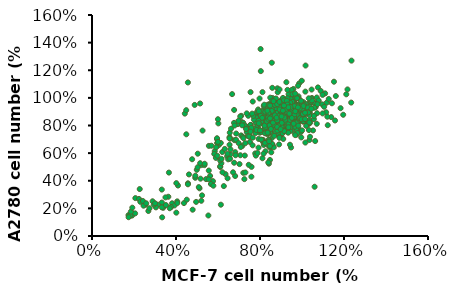
| Category | A2780 |
|---|---|
| 0.9499618999237999 | 0.926 |
| 0.8483616967233935 | 0.641 |
| 0.9154178308356616 | 0.842 |
| 0.9621539243078486 | 0.882 |
| 0.6817373634747269 | 0.434 |
| 1.0261620523241046 | 0.816 |
| 0.9885699771399543 | 0.89 |
| 0.9560579121158242 | 0.91 |
| 0.5120650241300483 | 0.345 |
| 0.8483616967233935 | 0.92 |
| 0.9306578613157226 | 0.902 |
| 0.8859537719075438 | 0.91 |
| 0.8768097536195072 | 0.878 |
| 1.0353060706121413 | 0.838 |
| 1.0170180340360682 | 0.904 |
| 1.034290068580137 | 0.963 |
| 0.9824739649479299 | 0.783 |
| 0.969265938531877 | 0.833 |
| 0.9001778003556007 | 0.89 |
| 0.905257810515621 | 0.914 |
| 0.8757937515875032 | 0.859 |
| 0.8879857759715519 | 0.933 |
| 0.936753873507747 | 0.911 |
| 0.9865379730759462 | 1.105 |
| 1.0525781051562104 | 0.765 |
| 1.0373380746761494 | 0.891 |
| 0.9540259080518161 | 0.89 |
| 0.9611379222758446 | 0.976 |
| 0.9357378714757429 | 0.853 |
| 0.9499618999237999 | 0.89 |
| 1.0363220726441453 | 0.936 |
| 1.0759461518923037 | 1.076 |
| 1.0353060706121413 | 0.695 |
| 0.9824739649479299 | 0.823 |
| 0.936753873507747 | 0.873 |
| 0.9144018288036576 | 0.806 |
| 0.4490728981457963 | 0.736 |
| 1.0078740157480315 | 0.968 |
| 1.1389382778765558 | 0.861 |
| 0.9255778511557023 | 1.113 |
| 1.062738125476251 | 0.687 |
| 0.9743459486918974 | 0.734 |
| 1.032258064516129 | 0.811 |
| 0.5760731521463043 | 0.397 |
| 0.904241808483617 | 0.843 |
| 0.9357378714757429 | 0.973 |
| 0.9702819405638812 | 0.862 |
| 0.9804419608839218 | 0.943 |
| 0.9286258572517145 | 0.798 |
| 1.016002032004064 | 0.676 |
| 0.9946659893319787 | 0.753 |
| 1.0048260096520194 | 0.827 |
| 0.9306578613157226 | 0.821 |
| 1.0200660401320802 | 0.797 |
| 1.1206502413004826 | 0.864 |
| 1.0891541783083567 | 1.05 |
| 0.9479298958597917 | 0.641 |
| 0.7772415544831089 | 0.598 |
| 0.8910337820675641 | 0.74 |
| 0.9662179324358648 | 0.743 |
| 0.8625857251714504 | 0.825 |
| 0.9733299466598934 | 0.774 |
| 1.157226314452629 | 0.836 |
| 1.1836423672847345 | 0.925 |
| 0.858521717043434 | 1.073 |
| 0.9641859283718568 | 0.79 |
| 0.9133858267716536 | 0.759 |
| 0.8839217678435357 | 0.863 |
| 0.8859537719075438 | 0.848 |
| 1.030226060452121 | 0.888 |
| 0.983489966979934 | 0.93 |
| 1.016002032004064 | 1.045 |
| 0.9286258572517145 | 0.853 |
| 0.9113538227076454 | 0.802 |
| 0.8473456946913894 | 0.55 |
| 0.6136652273304547 | 0.227 |
| 0.9499618999237999 | 0.771 |
| 1.0058420116840234 | 0.832 |
| 1.1226822453644907 | 0.802 |
| 1.1176022352044703 | 0.965 |
| 0.8775356874530428 | 0.821 |
| 0.8474830954169797 | 0.874 |
| 0.9821187077385425 | 0.882 |
| 1.0001502629601804 | 0.921 |
| 0.9304282494365139 | 0.927 |
| 0.983320811419985 | 1.011 |
| 0.8883546205860255 | 0.96 |
| 0.9448534936138242 | 0.76 |
| 0.8847483095416979 | 0.969 |
| 0.909992486851991 | 0.792 |
| 0.6034560480841472 | 0.657 |
| 0.9172051089406461 | 0.93 |
| 0.9111945905334335 | 0.976 |
| 0.9051840721262209 | 0.968 |
| 0.9003756574004508 | 0.948 |
| 0.9039819684447784 | 0.94 |
| 0.9051840721262209 | 0.909 |
| 0.9460555972952667 | 0.84 |
| 0.958076634109692 | 0.816 |
| 0.5265214124718257 | 0.763 |
| 0.9208114199849737 | 0.821 |
| 0.7801652892561983 | 0.582 |
| 0.9460555972952667 | 0.844 |
| 0.983320811419985 | 0.909 |
| 1.0049586776859505 | 0.934 |
| 0.9953418482344102 | 0.878 |
| 0.988129226145755 | 0.867 |
| 0.8739293764087153 | 0.905 |
| 0.9003756574004508 | 0.983 |
| 0.9448534936138242 | 1.007 |
| 0.9484598046581517 | 0.944 |
| 1.0169797145003756 | 1.234 |
| 0.9688955672426747 | 0.831 |
| 0.7981968444778362 | 0.862 |
| 0.9184072126220887 | 0.969 |
| 0.9460555972952667 | 0.819 |
| 0.8823441021788129 | 0.812 |
| 0.8943651389932382 | 0.829 |
| 0.9051840721262209 | 0.829 |
| 0.9111945905334335 | 0.829 |
| 0.8246431254695717 | 0.911 |
| 0.9592787377911345 | 0.968 |
| 0.8883546205860255 | 0.933 |
| 0.8679188580015026 | 0.87 |
| 0.8967693463561233 | 0.927 |
| 0.783771600300526 | 0.889 |
| 0.8474830954169797 | 0.858 |
| 0.8895567242674681 | 0.882 |
| 0.667167543200601 | 1.027 |
| 0.8210368144252442 | 0.924 |
| 0.9688955672426747 | 0.848 |
| 0.520510894064613 | 0.255 |
| 0.8751314800901577 | 0.883 |
| 0.9712997746055597 | 0.948 |
| 0.9208114199849737 | 0.886 |
| 0.98572501878287 | 0.94 |
| 0.7441021788129226 | 0.87 |
| 0.6912096168294516 | 0.81 |
| 0.9592787377911345 | 0.913 |
| 0.8186326070623591 | 0.913 |
| 0.8246431254695717 | 0.863 |
| 0.8667167543200601 | 0.934 |
| 0.9556724267468069 | 0.923 |
| 0.4916604057099925 | 0.422 |
| 0.7597295266716755 | 0.501 |
| 0.9869271224643126 | 0.835 |
| 0.887152516904583 | 0.795 |
| 0.909992486851991 | 0.896 |
| 0.6106686701728024 | 0.5 |
| 0.9364387678437265 | 0.87 |
| 1.0446280991735537 | 0.969 |
| 0.9508640120210368 | 1.019 |
| 1.033809166040571 | 0.911 |
| 0.9340345604808414 | 0.94 |
| 0.7873779113448535 | 0.902 |
| 0.9676934635612322 | 0.89 |
| 0.8847483095416979 | 0.928 |
| 0.9496619083395943 | 0.944 |
| 1.063861758076634 | 0.96 |
| 0.9773102930127724 | 0.896 |
| 0.9427189012018106 | 0.661 |
| 0.9152489464648041 | 0.799 |
| 0.8415795223973779 | 0.828 |
| 0.9302325581395349 | 0.792 |
| 0.8503199625409709 | 0.863 |
| 0.961448415795224 | 0.875 |
| 0.9264866552208522 | 0.881 |
| 0.678008428281567 | 0.694 |
| 0.9352270953644451 | 0.81 |
| 0.9477134384267207 | 0.932 |
| 0.8827844545028875 | 0.932 |
| 0.8415795223973779 | 0.905 |
| 0.9077571406274387 | 0.968 |
| 0.8128609333541439 | 0.816 |
| 0.8365849851724676 | 0.87 |
| 0.941470266895583 | 0.852 |
| 0.9140003121585766 | 0.825 |
| 0.4570001560792883 | 0.381 |
| 0.83533635086624 | 0.948 |
| 0.9189948493834869 | 0.917 |
| 0.884033088809115 | 0.877 |
| 0.8802871858904323 | 0.937 |
| 0.8478226939285157 | 0.891 |
| 0.9826751990010926 | 0.889 |
| 0.9452161698142656 | 0.866 |
| 0.872795380053067 | 0.819 |
| 0.9589511471827689 | 0.866 |
| 0.4420165444045575 | 0.886 |
| 0.9976588106758233 | 0.923 |
| 0.9189948493834869 | 0.898 |
| 0.9252380209146246 | 0.841 |
| 0.904011237708756 | 0.834 |
| 0.9976588106758233 | 0.944 |
| 0.9277352895270797 | 0.782 |
| 0.9364757296706727 | 0.926 |
| 0.9227407523021695 | 0.923 |
| 0.855314499765881 | 0.707 |
| 0.9102544092398939 | 0.946 |
| 0.9876697362260028 | 0.845 |
| 0.9339784610582176 | 0.912 |
| 0.9027626034025285 | 0.829 |
| 0.9102544092398939 | 0.96 |
| 1.038863742781333 | 0.82 |
| 0.8403308880911503 | 0.937 |
| 0.83533635086624 | 0.937 |
| 0.9189948493834869 | 0.962 |
| 0.9227407523021695 | 0.919 |
| 0.9577025128765413 | 0.868 |
| 0.9364757296706727 | 0.783 |
| 0.9002653347900733 | 0.947 |
| 0.8877789917277977 | 0.947 |
| 0.8678008428281567 | 0.92 |
| 0.8653035742157016 | 0.907 |
| 0.9626970501014516 | 0.94 |
| 1.0476041829249259 | 0.999 |
| 1.0076478851256438 | 0.95 |
| 0.9152489464648041 | 0.801 |
| 0.8915248946464804 | 0.861 |
| 0.9676915873263618 | 0.866 |
| 0.9764320274699547 | 0.949 |
| 0.9214921179959419 | 0.9 |
| 1.0963009208678007 | 0.953 |
| 1.1150304354612144 | 0.896 |
| 1.1425003901982207 | 0.961 |
| 1.0563446230685187 | 0.846 |
| 0.9252380209146246 | 0.851 |
| 0.9589511471827689 | 1.064 |
| 0.7978773216794132 | 0.995 |
| 0.9851724676135477 | 0.994 |
| 1.0538473544560636 | 0.966 |
| 1.0650850632121118 | 0.933 |
| 0.9664429530201343 | 0.933 |
| 0.9577025128765413 | 0.935 |
| 0.9514593413454034 | 0.891 |
| 1.0438582800062433 | 0.973 |
| 0.904011237708756 | 0.903 |
| 0.6105821757452786 | 0.505 |
| 1.0176369595754644 | 0.93 |
| 1.0451069143124707 | 0.995 |
| 1.110035898236304 | 1.032 |
| 1.0180699730872742 | 0.927 |
| 0.9862873253876714 | 0.925 |
| 0.9463027040881712 | 0.925 |
| 0.878636421889017 | 0.81 |
| 0.9698833781878765 | 0.864 |
| 0.9196462898885044 | 0.958 |
| 0.9257977700884276 | 0.925 |
| 0.8929898756888376 | 0.922 |
| 1.0354991669870564 | 0.874 |
| 0.9965397923875432 | 0.714 |
| 0.9134948096885813 | 0.866 |
| 0.9268230167884147 | 0.892 |
| 0.9104190695886197 | 0.903 |
| 0.8745354350890683 | 0.954 |
| 0.8581314878892734 | 0.963 |
| 1.0180699730872742 | 0.954 |
| 1.0703575547866204 | 0.812 |
| 0.9780853517877739 | 0.745 |
| 0.8499295142893759 | 0.831 |
| 0.9698833781878765 | 0.87 |
| 0.9309240035883635 | 0.931 |
| 0.9534794309880815 | 0.858 |
| 0.9709086248878637 | 0.865 |
| 0.9422017172882224 | 0.856 |
| 1.0129437395873382 | 0.879 |
| 0.8940151223888249 | 0.866 |
| 0.9339997436883251 | 0.942 |
| 0.8806869152889915 | 0.833 |
| 0.9852620786876842 | 0.952 |
| 0.939125977188261 | 0.885 |
| 0.9575804177880303 | 0.912 |
| 0.9545046776880687 | 0.897 |
| 1.0262719466871717 | 0.904 |
| 0.9381007304882737 | 0.909 |
| 0.9504036908881199 | 0.936 |
| 0.9360502370882994 | 0.802 |
| 0.9022170959887222 | 0.889 |
| 0.9339997436883251 | 0.781 |
| 0.9257977700884276 | 0.919 |
| 0.972959118287838 | 0.904 |
| 0.8468537741894143 | 0.673 |
| 0.9914135588876073 | 0.941 |
| 0.9534794309880815 | 0.916 |
| 0.9001666025887479 | 0.733 |
| 0.8970908624887863 | 0.858 |
| 0.9442522106881969 | 0.787 |
| 0.8673587081891581 | 0.881 |
| 0.9627066512879662 | 0.97 |
| 1.000640779187492 | 0.764 |
| 0.9350249903883122 | 0.897 |
| 0.9073433294886583 | 0.913 |
| 0.995514545687556 | 0.921 |
| 0.9145200563885685 | 0.897 |
| 0.9134948096885813 | 0.981 |
| 0.9093938228886326 | 1 |
| 0.9339997436883251 | 0.973 |
| 0.9216967832884788 | 0.91 |
| 0.9780853517877739 | 0.825 |
| 0.9268230167884147 | 0.932 |
| 0.9791105984877612 | 0.918 |
| 0.9032423426887095 | 0.749 |
| 0.9483531974881456 | 0.955 |
| 0.9401512238882481 | 0.982 |
| 0.8601819812892477 | 0.66 |
| 0.9206715365884917 | 0.933 |
| 0.9442522106881969 | 0.94 |
| 0.9637318979879533 | 0.94 |
| 1.0108932461873639 | 0.883 |
| 0.9339997436883251 | 0.748 |
| 0.9514289375881071 | 0.881 |
| 0.9319492502883506 | 0.956 |
| 0.8960656157887992 | 0.962 |
| 0.9001666025887479 | 0.92 |
| 0.939125977188261 | 0.895 |
| 0.9862873253876714 | 0.911 |
| 1.0037165192874535 | 0.945 |
| 1.000640779187492 | 0.925 |
| 1.0016660258874792 | 0.96 |
| 1.0098679994873767 | 0.948 |
| 0.9657823913879278 | 0.989 |
| 0.8424450272342142 | 0.954 |
| 0.9618721000605205 | 0.946 |
| 0.9166834779100262 | 0.98 |
| 0.7843453701835787 | 0.76 |
| 0.7746620940084729 | 0.764 |
| 0.936050030260238 | 1.027 |
| 0.9812386524107323 | 0.904 |
| 0.9876941698608029 | 0.842 |
| 0.9860802904982853 | 0.851 |
| 0.9505749445228969 | 0.856 |
| 0.8117813193463789 | 1.042 |
| 0.45672785959249546 | 1.112 |
| 0.9070002017349204 | 0.872 |
| 0.8827920112971556 | 0.854 |
| 0.3340730280411539 | 0.135 |
| 1.0038329634859795 | 0.883 |
| 0.9634859794230382 | 0.949 |
| 0.4486584627799072 | 0.911 |
| 0.9344361508977204 | 0.925 |
| 0.8456727859592496 | 0.88 |
| 0.802098043171273 | 0.894 |
| 0.8182368367964494 | 0.659 |
| 1.0215856364736735 | 0.898 |
| 1.032882792011297 | 0.899 |
| 0.8827920112971556 | 1.069 |
| 0.4793221706677426 | 0.19 |
| 0.9473471857978616 | 0.932 |
| 0.9215251159975791 | 0.893 |
| 0.8827920112971556 | 0.933 |
| 0.9118418398224732 | 0.96 |
| 0.8682670970344967 | 0.862 |
| 1.005446842848497 | 0.917 |
| 0.5955214847690136 | 0.701 |
| 0.9231389953600968 | 0.908 |
| 0.9505749445228969 | 0.957 |
| 0.9473471857978616 | 0.897 |
| 0.9538027032479323 | 0.924 |
| 0.9005446842848497 | 0.912 |
| 0.4890054468428485 | 0.949 |
| 0.9893080492233206 | 0.915 |
| 0.7520677829332257 | 0.681 |
| 0.7891870082711318 | 0.839 |
| 0.9747831349606617 | 0.879 |
| 0.9344361508977204 | 0.816 |
| 0.9134557191849909 | 0.972 |
| 0.9909219285858382 | 0.938 |
| 0.6277990720193666 | 0.361 |
| 1.047407706273956 | 0.981 |
| 0.9005446842848497 | 0.859 |
| 0.940891668347791 | 0.904 |
| 0.9521888238854146 | 0.993 |
| 0.9150695985475086 | 0.856 |
| 0.9989913253984265 | 1.124 |
| 0.936050030260238 | 0.989 |
| 0.9021585636473674 | 0.927 |
| 0.514827516643131 | 0.959 |
| 0.8440589065967319 | 0.699 |
| 0.8537421827718378 | 0.746 |
| 0.898930804922332 | 0.762 |
| 0.8263062336090378 | 0.614 |
| 0.8747226144845672 | 0.799 |
| 0.8698809763970143 | 0.85 |
| 0.8601977002219084 | 0.999 |
| 0.9602582206980028 | 0.813 |
| 0.6939681258825903 | 0.811 |
| 0.9005446842848497 | 0.857 |
| 0.9279806334476498 | 0.877 |
| 0.9215251159975791 | 0.87 |
| 0.9618721000605205 | 0.936 |
| 0.978010893685697 | 0.998 |
| 1.0457938269114384 | 1.06 |
| 1.032882792011297 | 0.767 |
| 0.9425055477103087 | 0.841 |
| 0.8133951987088965 | 0.851 |
| 0.8279201129715553 | 0.792 |
| 0.9021585636473674 | 0.822 |
| 0.9909219285858382 | 0.853 |
| 0.9554165826104498 | 0.971 |
| 0.9812386524107323 | 1.088 |
| 1.0780714141617913 | 0.979 |
| 0.5663830470380479 | 0.377 |
| 0.3390592390431851 | 0.204 |
| 0.2684218975758549 | 0.181 |
| 0.8604912506020228 | 0.84 |
| 0.7500401348531064 | 0.737 |
| 0.8437951517097447 | 0.859 |
| 0.7371969818590464 | 0.752 |
| 0.9580992133568791 | 0.979 |
| 0.5085888585647776 | 0.354 |
| 0.33263766254615507 | 0.242 |
| 0.5625301011398298 | 0.435 |
| 0.6819714239845882 | 0.607 |
| 0.8759030341948948 | 0.888 |
| 0.8592069353026168 | 0.894 |
| 0.946540375662225 | 0.991 |
| 0.8476480976079628 | 0.776 |
| 0.33263766254615507 | 0.207 |
| 0.5779418847327019 | 0.364 |
| 0.8142558998234066 | 0.696 |
| 0.8476480976079628 | 0.752 |
| 0.8990207095842029 | 0.789 |
| 0.7795793867394445 | 0.782 |
| 0.8283833681168727 | 0.747 |
| 0.7988441162305346 | 0.748 |
| 0.911863862578263 | 0.822 |
| 0.7102263605715203 | 0.728 |
| 0.5561085246427998 | 0.474 |
| 0.31337293305506503 | 0.227 |
| 0.6858243698828063 | 0.696 |
| 0.7063734146733023 | 0.585 |
| 0.304382725959223 | 0.207 |
| 0.8656285117996468 | 0.642 |
| 0.7423342430566704 | 0.724 |
| 0.7654519184459785 | 0.974 |
| 0.3634612297318992 | 0.284 |
| 0.7988441162305346 | 0.835 |
| 0.7590303419489485 | 0.429 |
| 0.8848932412907369 | 0.845 |
| 0.6434419650024081 | 0.577 |
| 0.7205008829667684 | 0.457 |
| 0.5240006421576497 | 0.294 |
| 0.7333440359608284 | 0.792 |
| 0.7564617113501365 | 0.804 |
| 0.648579226200032 | 0.555 |
| 0.8759030341948948 | 0.922 |
| 0.906726601380639 | 0.793 |
| 0.8861775565901429 | 0.802 |
| 0.8373735752127147 | 0.946 |
| 0.8116872692245947 | 0.563 |
| 0.8168245304222187 | 0.852 |
| 0.8412265211109328 | 0.696 |
| 0.4957457055707176 | 0.247 |
| 0.6768341627869642 | 0.53 |
| 0.8348049446139028 | 0.736 |
| 0.8913148177877669 | 0.727 |
| 0.8142558998234066 | 0.871 |
| 0.8913148177877669 | 0.881 |
| 0.8656285117996468 | 0.887 |
| 0.8296676834162787 | 0.76 |
| 0.8694814576978648 | 0.889 |
| 0.38144164392358326 | 0.237 |
| 0.40584363461229733 | 0.251 |
| 0.4379515170974474 | 0.238 |
| 0.8232461069192487 | 0.796 |
| 0.8348049446139028 | 0.943 |
| 0.8001284315299406 | 0.878 |
| 0.8489324129073688 | 1.002 |
| 0.8104029539251887 | 0.902 |
| 0.8592069353026168 | 0.786 |
| 0.6716969015893401 | 0.461 |
| 0.8861775565901429 | 0.738 |
| 0.9503933215604431 | 1.057 |
| 0.39300048161823725 | 0.221 |
| 0.635736073205972 | 0.448 |
| 0.7937068550329106 | 0.703 |
| 0.7487558195537004 | 0.72 |
| 0.8155402151228126 | 0.679 |
| 0.8399422058115267 | 0.655 |
| 0.8925991330871729 | 0.717 |
| 0.8759030341948948 | 0.995 |
| 0.7657393850658858 | 0.712 |
| 0.9985358711566618 | 0.844 |
| 1.0717423133235724 | 0.889 |
| 0.3762811127379209 | 0.21 |
| 1.0702781844802343 | 1.003 |
| 1.0571010248901904 | 0.869 |
| 1.0351390922401171 | 0.822 |
| 1.2108345534407028 | 1.026 |
| 0.9019033674963397 | 0.792 |
| 0.49194729136163984 | 0.436 |
| 0.7920937042459737 | 0.861 |
| 0.8843338213762811 | 1.041 |
| 0.821376281112738 | 0.778 |
| 0.8345534407027818 | 0.891 |
| 0.4568081991215227 | 0.374 |
| 0.9692532942898975 | 1.001 |
| 0.6764275256222547 | 0.819 |
| 0.5036603221083455 | 0.596 |
| 0.8784773060029283 | 0.89 |
| 0.8330893118594437 | 0.89 |
| 0.7276720351390923 | 0.583 |
| 0.34992679355783307 | 0.28 |
| 1.0790629575402635 | 0.981 |
| 1.1522693997071742 | 1.117 |
| 0.9106881405563689 | 0.703 |
| 0.9150805270863837 | 0.885 |
| 0.8843338213762811 | 0.852 |
| 0.8872620790629575 | 0.799 |
| 1.0732064421669107 | 0.954 |
| 1.2342606149341142 | 0.966 |
| 1.1961932650073206 | 0.878 |
| 1.0600292825768667 | 0.357 |
| 0.8740849194729137 | 0.756 |
| 0.8916544655929722 | 0.847 |
| 0.9150805270863837 | 0.943 |
| 0.91800878477306 | 0.829 |
| 0.9765739385065886 | 0.998 |
| 1.026354319180088 | 0.93 |
| 1.0014641288433381 | 0.922 |
| 1.0585651537335286 | 0.929 |
| 1.0380673499267936 | 0.718 |
| 0.8667642752562226 | 0.804 |
| 0.83601756954612 | 0.787 |
| 0.9575402635431918 | 0.853 |
| 1.1054172767203514 | 0.936 |
| 1.1273792093704247 | 0.992 |
| 1.1610541727672035 | 1.013 |
| 0.9516837481698389 | 0.966 |
| 0.6588579795021962 | 0.59 |
| 0.2547584187408492 | 0.227 |
| 0.9150805270863837 | 0.847 |
| 0.2884333821376281 | 0.251 |
| 0.8374816983894583 | 0.745 |
| 1.0980966325036603 | 1.022 |
| 0.9956076134699854 | 0.979 |
| 1.2357247437774523 | 1.27 |
| 0.9619326500732065 | 0.86 |
| 0.7159590043923866 | 0.652 |
| 0.9077598828696926 | 0.744 |
| 0.8169838945827232 | 0.596 |
| 0.9502196193265008 | 0.909 |
| 0.8535871156661786 | 0.606 |
| 1.0980966325036603 | 0.888 |
| 1.2166910688140555 | 1.061 |
| 0.9677891654465594 | 0.73 |
| 0.5212298682284041 | 0.513 |
| 0.29428989751098095 | 0.227 |
| 0.9707174231332357 | 0.905 |
| 0.3323572474377745 | 0.336 |
| 0.3001464128843338 | 0.237 |
| 0.6456808199121523 | 0.418 |
| 0.9399707174231332 | 0.881 |
| 0.8828696925329429 | 0.764 |
| 0.9341142020497804 | 0.943 |
| 0.8448023426061494 | 0.801 |
| 0.849194729136164 | 0.894 |
| 0.8535871156661786 | 0.862 |
| 0.7759882869692533 | 0.841 |
| 0.8814055636896047 | 0.789 |
| 0.7935578330893118 | 0.774 |
| 0.6203150461705594 | 0.608 |
| 0.8843020097772949 | 0.963 |
| 0.6865833785985878 | 0.742 |
| 0.7332971211298207 | 0.791 |
| 0.8908202064095601 | 0.663 |
| 0.8245518739815317 | 0.787 |
| 0.8669201520912547 | 0.873 |
| 0.8614883215643672 | 0.898 |
| 0.6572514937533949 | 0.559 |
| 0.35198261814231396 | 0.224 |
| 0.5953286257468767 | 0.708 |
| 0.9082020640956002 | 0.96 |
| 0.19120043454644214 | 0.165 |
| 0.24551873981531777 | 0.219 |
| 0.40630092341118956 | 0.239 |
| 0.20640956002172733 | 0.274 |
| 0.5431830526887561 | 0.412 |
| 0.7300380228136882 | 0.672 |
| 0.6550787615426399 | 0.715 |
| 0.7897881586094514 | 0.813 |
| 0.6768060836501901 | 0.912 |
| 0.755024443237371 | 1.042 |
| 0.22379141770776753 | 0.268 |
| 0.8039109179793591 | 1.194 |
| 0.18902770233568714 | 0.164 |
| 0.7126561651276481 | 0.825 |
| 0.23030961434003258 | 0.247 |
| 0.6159695817490495 | 0.527 |
| 0.8158609451385117 | 0.874 |
| 0.18468223791417707 | 0.157 |
| 0.5975013579576317 | 0.674 |
| 0.892992938620315 | 1.061 |
| 0.8104291146116241 | 0.695 |
| 0.7876154263986963 | 0.804 |
| 0.6550787615426399 | 0.661 |
| 0.7887017925040739 | 0.83 |
| 0.1792504073872895 | 0.15 |
| 0.65942422596415 | 0.627 |
| 0.7561108093427485 | 0.764 |
| 0.8028245518739815 | 1.354 |
| 0.7463335143943509 | 0.515 |
| 0.6105377512221619 | 0.546 |
| 0.5844649646931016 | 0.614 |
| 0.19120043454644214 | 0.148 |
| 0.4095600217273221 | 0.365 |
| 0.793047256925584 | 0.64 |
| 0.8821292775665399 | 0.839 |
| 0.8408473655621944 | 0.841 |
| 0.2737642585551331 | 0.201 |
| 0.24225964149918522 | 0.253 |
| 0.5822922324823465 | 0.594 |
| 0.8071700162954916 | 0.753 |
| 0.8973384030418251 | 0.839 |
| 0.7897881586094514 | 0.846 |
| 0.8658337859858772 | 0.948 |
| 0.7539380771319935 | 0.804 |
| 0.5562194459532862 | 0.41 |
| 0.8202064095600218 | 0.831 |
| 0.8180336773492667 | 0.942 |
| 0.6453014665942423 | 0.596 |
| 0.931015752308528 | 1.058 |
| 0.9538294405214557 | 0.971 |
| 0.8701792504073873 | 0.949 |
| 0.6322650733297122 | 0.63 |
| 0.935361216730038 | 0.787 |
| 0.7202607278652906 | 0.82 |
| 0.7180879956545356 | 0.719 |
| 0.710483432916893 | 0.87 |
| 0.5355784899511136 | 0.513 |
| 0.5898967952199892 | 0.566 |
| 0.5149375339489408 | 0.527 |
| 0.5964149918522542 | 0.672 |
| 0.7854426941879413 | 0.858 |
| 0.8560564910374796 | 0.921 |
| 0.20532319391634982 | 0.164 |
| 0.931015752308528 | 0.997 |
| 0.8853883758826725 | 0.855 |
| 0.4617055947854427 | 0.446 |
| 0.17381857686040195 | 0.151 |
| 0.6789788158609451 | 0.8 |
| 0.8134220422331502 | 0.815 |
| 0.7266415967601967 | 0.801 |
| 0.7208562337286665 | 0.708 |
| 0.7058142898466879 | 0.865 |
| 0.8238356956899046 | 0.674 |
| 0.4767139137980908 | 0.556 |
| 0.8157361874457623 | 0.858 |
| 0.6016777552791438 | 0.815 |
| 0.7254845241538906 | 0.412 |
| 0.5565519236332079 | 0.652 |
| 0.759039629736766 | 0.782 |
| 0.7914376627133353 | 0.916 |
| 0.7787098640439688 | 0.745 |
| 0.8203644778709864 | 0.95 |
| 0.8967312698871854 | 0.935 |
| 0.6560601677755279 | 0.748 |
| 0.8620190916980041 | 0.821 |
| 0.8249927682962106 | 0.899 |
| 0.18166039919004917 | 0.148 |
| 0.8030083887763957 | 0.87 |
| 0.37026323401793465 | 0.201 |
| 0.8411917847844952 | 0.948 |
| 0.8481342204223316 | 0.944 |
| 0.8562337286664738 | 1.255 |
| 0.8678044547295343 | 0.725 |
| 0.8921029794619613 | 0.711 |
| 0.8573908012727799 | 0.667 |
| 0.8215215504772925 | 0.799 |
| 0.9430141741394272 | 0.888 |
| 0.9245010124385306 | 0.887 |
| 0.1828174717963552 | 0.149 |
| 0.18513161700896733 | 0.176 |
| 0.6213479895863465 | 0.461 |
| 0.8435059299971073 | 0.685 |
| 0.8516054382412497 | 0.775 |
| 0.7648249927682962 | 0.657 |
| 0.9187156494070002 | 0.86 |
| 0.9407000289268151 | 0.899 |
| 0.8874746890367371 | 0.852 |
| 1.0321087648249927 | 0.997 |
| 0.6167196991611223 | 0.558 |
| 0.2580271912062482 | 0.237 |
| 0.7798669366502748 | 0.823 |
| 0.8816893260052068 | 0.837 |
| 0.9152444315880821 | 0.759 |
| 0.8921029794619613 | 0.932 |
| 0.8458200752097194 | 0.894 |
| 0.9545849002024877 | 1.026 |
| 0.9418571015331212 | 0.909 |
| 0.8064796065953138 | 0.829 |
| 0.9140873589817761 | 0.983 |
| 0.9441712467457333 | 0.965 |
| 0.7879664448944171 | 0.601 |
| 0.8909459068556552 | 0.871 |
| 0.9245010124385306 | 0.945 |
| 0.9279722302574487 | 0.979 |
| 0.9638414810529361 | 0.881 |
| 1.0066531674862598 | 0.94 |
| 0.8469771478160255 | 0.65 |
| 0.9152444315880821 | 0.926 |
| 0.9071449233439398 | 0.879 |
| 0.9279722302574487 | 0.936 |
| 0.936071738501591 | 0.946 |
| 0.8816893260052068 | 0.954 |
| 0.8978883424934915 | 0.774 |
| 1.0147526757304022 | 0.846 |
| 1.0286375470060747 | 0.894 |
| 0.9545849002024877 | 0.907 |
| 0.9256580850448366 | 0.901 |
| 0.9164015041943882 | 0.878 |
| 0.9777263523286086 | 0.942 |
| 0.9673126988718542 | 1.031 |
| 0.9036737055250217 | 0.819 |
| 0.9823546427538328 | 0.798 |
| 0.8053225339890078 | 0.698 |
| 1.0147526757304022 | 0.893 |
| 0.9638414810529361 | 0.933 |
| 0.9164015041943882 | 0.865 |
| 0.9684697714781603 | 0.934 |
| 0.9638414810529361 | 0.94 |
| 0.40155642023346305 | 0.169 |
| 0.930739299610895 | 0.952 |
| 0.9473411154345006 | 0.922 |
| 0.8103761348897536 | 0.855 |
| 0.7802853437094682 | 0.859 |
| 0.7833981841763943 | 0.767 |
| 0.8539559014267185 | 0.86 |
| 0.8238651102464332 | 0.744 |
| 0.5364461738002594 | 0.523 |
| 0.45136186770428016 | 0.263 |
| 0.9006485084306096 | 0.903 |
| 0.7304798962386511 | 0.46 |
| 0.9255512321660182 | 0.9 |
| 0.9027237354085603 | 0.901 |
| 0.5540856031128405 | 0.148 |
| 0.1743190661478599 | 0.136 |
| 0.5686121919584954 | 0.654 |
| 0.6132295719844358 | 0.673 |
| 0.8363164721141375 | 0.748 |
| 0.698313878080415 | 0.673 |
| 0.8 | 0.764 |
| 0.7979247730220493 | 0.81 |
| 0.9068741893644617 | 0.909 |
| 0.9452658884565499 | 0.933 |
| 0.8705577172503243 | 0.874 |
| 0.5966277561608301 | 0.581 |
| 0.6619974059662775 | 0.777 |
| 0.77094682230869 | 0.842 |
| 0.7149156939040208 | 0.801 |
| 0.8425421530479896 | 0.524 |
| 0.5914396887159533 | 0.642 |
| 0.8560311284046692 | 0.906 |
| 0.5997405966277561 | 0.682 |
| 0.7086900129701686 | 0.644 |
| 0.6837872892347601 | 0.585 |
| 0.49909208819714657 | 0.479 |
| 0.7543450064850843 | 0.755 |
| 0.919325551232166 | 0.915 |
| 0.8404669260700389 | 0.891 |
| 0.8581063553826199 | 0.98 |
| 0.5167315175097277 | 0.415 |
| 0.503242542153048 | 0.498 |
| 0.8321660181582361 | 0.831 |
| 0.8352788586251622 | 0.907 |
| 0.8383916990920882 | 0.859 |
| 0.7367055771725033 | 0.888 |
| 0.767833981841764 | 0.869 |
| 0.7626459143968871 | 0.886 |
| 0.7024643320363164 | 0.521 |
| 0.9680933852140078 | 0.903 |
| 1.0448767833981842 | 0.921 |
| 0.9203631647211413 | 0.842 |
| 0.951491569390402 | 0.855 |
| 0.8933852140077821 | 0.916 |
| 0.3662775616083009 | 0.459 |
| 0.7948119325551232 | 0.903 |
| 0.9162127107652399 | 0.857 |
| 0.8394293125810636 | 0.532 |
| 0.9400778210116731 | 0.886 |
| 0.8788586251621271 | 0.857 |
| 0.8404669260700389 | 0.844 |
| 0.7927367055771725 | 0.834 |
| 0.6578469520103761 | 0.705 |
| 0.9348897535667964 | 0.932 |
| 0.9027237354085603 | 0.865 |
| 0.988845654993515 | 0.924 |
| 0.9089494163424124 | 0.908 |
| 0.8477302204928664 | 0.852 |
| 0.6547341115434501 | 0.707 |
| 0.5997405966277561 | 0.846 |
| 0.6972762645914397 | 0.834 |
| 0.191958495460441 | 0.205 |
| 0.980544747081712 | 0.931 |
| 0.7335927367055771 | 0.775 |
| 0.7937743190661478 | 0.816 |
| 0.40155642023346305 | 0.383 |
| 0.9141374837872892 | 0.944 |
| 0.8923476005188068 | 0.971 |
| 0.2272373540856031 | 0.34 |
| 0.8643320363164722 | 0.976 |